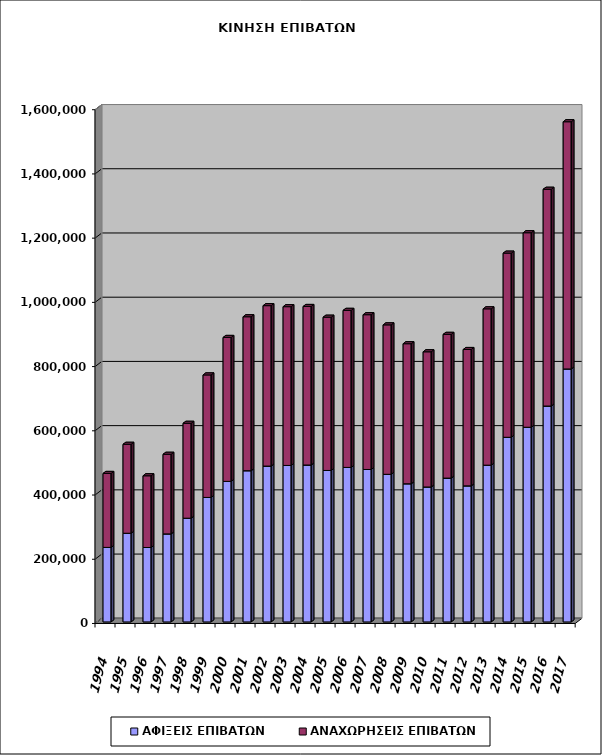
| Category | ΑΦΙΞΕΙΣ ΕΠΙΒΑΤΩΝ | ΑΝΑΧΩΡΗΣΕΙΣ ΕΠΙΒΑΤΩΝ |
|---|---|---|
| 1994.0 | 232072 | 230332 |
| 1995.0 | 276168 | 277012 |
| 1996.0 | 231788 | 223365 |
| 1997.0 | 274099 | 247967 |
| 1998.0 | 323038 | 295511 |
| 1999.0 | 387693 | 381504 |
| 2000.0 | 437664 | 448257 |
| 2001.0 | 470893 | 479452 |
| 2002.0 | 485362 | 499607 |
| 2003.0 | 487314 | 494434 |
| 2004.0 | 488692 | 493717 |
| 2005.0 | 471659 | 477285 |
| 2006.0 | 481153 | 489104 |
| 2007.0 | 474722 | 482014 |
| 2008.0 | 459719 | 465378 |
| 2009.0 | 430218 | 436128 |
| 2010.0 | 420284 | 420993 |
| 2011.0 | 447885 | 447625 |
| 2012.0 | 423698 | 424686 |
| 2013.0 | 488161 | 486879 |
| 2014.0 | 575009 | 573455 |
| 2015.0 | 606272 | 605732 |
| 2016.0 | 672350 | 675044 |
| 2017.0 | 787807 | 769853 |